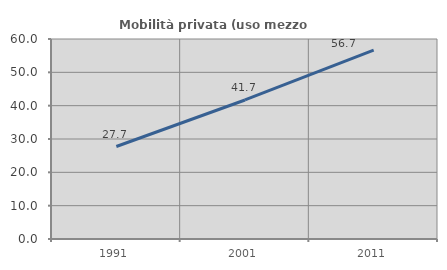
| Category | Mobilità privata (uso mezzo privato) |
|---|---|
| 1991.0 | 27.742 |
| 2001.0 | 41.71 |
| 2011.0 | 56.686 |